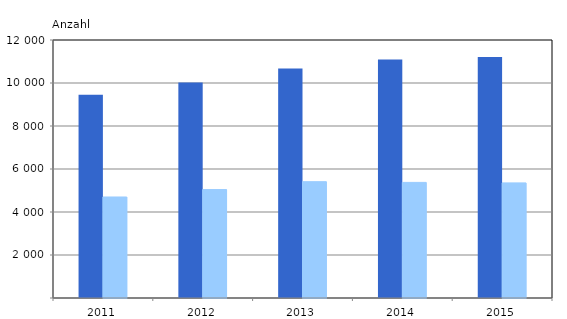
| Category | 18 Jahre bis unter Altersgrenze | Altersgrenze und älter |
|---|---|---|
| 2011.0 | 9455 | 4698 |
| 2012.0 | 10018 | 5043 |
| 2013.0 | 10676 | 5410 |
| 2014.0 | 11088 | 5377 |
| 2015.0 | 11208 | 5354 |